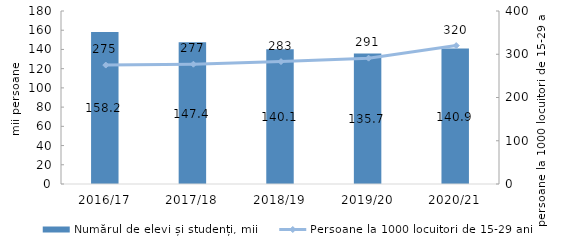
| Category | Numărul de elevi și studenți, mii |
|---|---|
| 2016/17 | 158.2 |
| 2017/18 | 147.4 |
| 2018/19 | 140.1 |
| 2019/20 | 135.7 |
| 2020/21 | 140.9 |